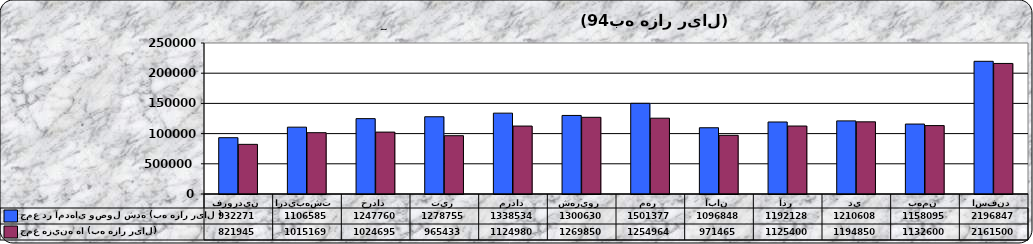
| Category | جمع در آمدهاي وصول شده (به هزار ریال ) | جمع هزينه ها (به هزار ریال) |
|---|---|---|
| فروردين | 932271 | 821945 |
| ارديبهشت | 1106585 | 1015169 |
| خرداد | 1247760 | 1024695 |
| تير | 1278755 | 965433 |
| مرداد | 1338534 | 1124980 |
| شهريور | 1300630 | 1269850 |
| مهر | 1501377 | 1254964 |
| آبان | 1096848 | 971465 |
| آذر | 1192128 | 1125400 |
| دي | 1210608 | 1194850 |
| بهمن | 1158095 | 1132600 |
| اسفند | 2196847 | 2161500 |